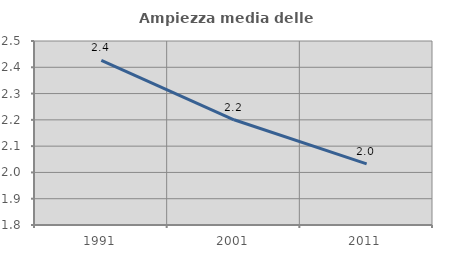
| Category | Ampiezza media delle famiglie |
|---|---|
| 1991.0 | 2.427 |
| 2001.0 | 2.2 |
| 2011.0 | 2.032 |